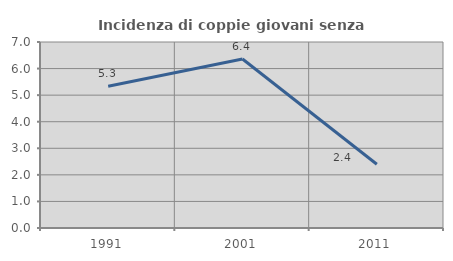
| Category | Incidenza di coppie giovani senza figli |
|---|---|
| 1991.0 | 5.337 |
| 2001.0 | 6.36 |
| 2011.0 | 2.4 |